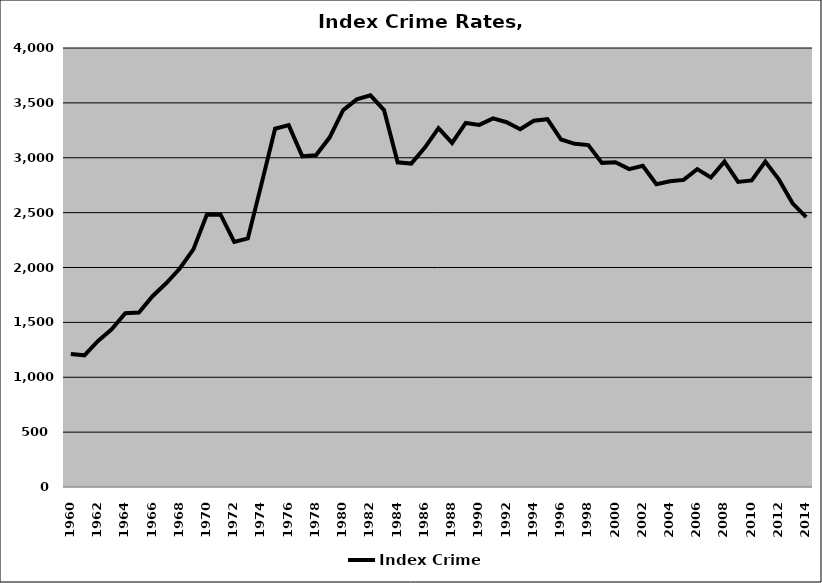
| Category | Index Crime |
|---|---|
| 1960.0 | 1212.709 |
| 1961.0 | 1199.935 |
| 1962.0 | 1331.376 |
| 1963.0 | 1437.189 |
| 1964.0 | 1583.191 |
| 1965.0 | 1589.714 |
| 1966.0 | 1738.36 |
| 1967.0 | 1856.256 |
| 1968.0 | 1991.05 |
| 1969.0 | 2164.882 |
| 1970.0 | 2484.103 |
| 1971.0 | 2481.718 |
| 1972.0 | 2233.647 |
| 1973.0 | 2265.26 |
| 1974.0 | 2759.726 |
| 1975.0 | 3264.37 |
| 1976.0 | 3296.849 |
| 1977.0 | 3013.331 |
| 1978.0 | 3023.042 |
| 1979.0 | 3183.896 |
| 1980.0 | 3433.742 |
| 1981.0 | 3531.521 |
| 1982.0 | 3568.421 |
| 1983.0 | 3434.814 |
| 1984.0 | 2958.501 |
| 1985.0 | 2947.182 |
| 1986.0 | 3092.194 |
| 1987.0 | 3270.003 |
| 1988.0 | 3134.802 |
| 1989.0 | 3317.145 |
| 1990.0 | 3299.436 |
| 1991.0 | 3358.255 |
| 1992.0 | 3323.542 |
| 1993.0 | 3259.673 |
| 1994.0 | 3337.235 |
| 1995.0 | 3351.736 |
| 1996.0 | 3166.298 |
| 1997.0 | 3127.047 |
| 1998.0 | 3115.6 |
| 1999.0 | 2953.425 |
| 2000.0 | 2959.744 |
| 2001.0 | 2896.813 |
| 2002.0 | 2926.558 |
| 2003.0 | 2758.543 |
| 2004.0 | 2785.263 |
| 2005.0 | 2797.819 |
| 2006.0 | 2896.478 |
| 2007.0 | 2819.845 |
| 2008.0 | 2964.273 |
| 2009.0 | 2779.575 |
| 2010.0 | 2793.887 |
| 2011.0 | 2965.595 |
| 2012.0 | 2800.447 |
| 2013.0 | 2584.972 |
| 2014.0 | 2458.526 |